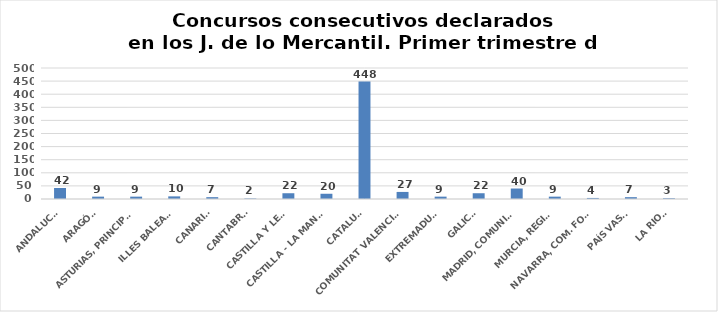
| Category | Consecutivos declarados |
|---|---|
| ANDALUCÍA | 42 |
| ARAGÓN | 9 |
| ASTURIAS, PRINCIPADO | 9 |
| ILLES BALEARS | 10 |
| CANARIAS | 7 |
| CANTABRIA | 2 |
| CASTILLA Y LEÓN | 22 |
| CASTILLA - LA MANCHA | 20 |
| CATALUÑA | 448 |
| COMUNITAT VALENCIANA | 27 |
| EXTREMADURA | 9 |
| GALICIA | 22 |
| MADRID, COMUNIDAD | 40 |
| MURCIA, REGIÓN | 9 |
| NAVARRA, COM. FORAL | 4 |
| PAÍS VASCO | 7 |
| LA RIOJA | 3 |